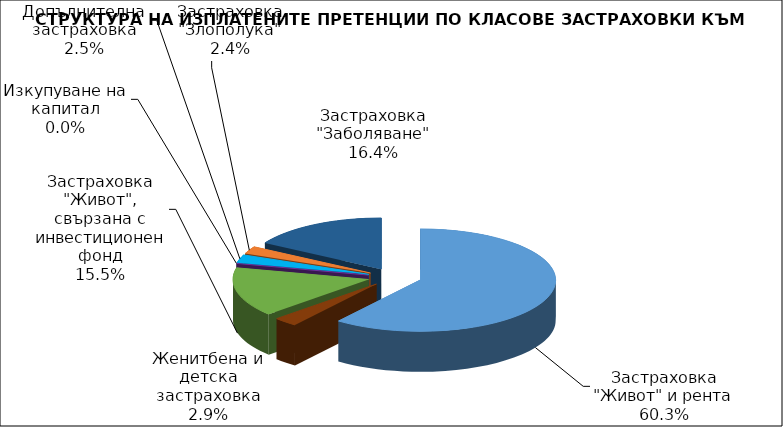
| Category | Застраховка "Живот" и рента |
|---|---|
| Застраховка "Живот" и рента | 66351634.664 |
| Женитбена и детска застраховка | 3188314.668 |
| Застраховка "Живот", свързана с инвестиционен фонд | 17061516.96 |
| Изкупуване на капитал | 0 |
| Допълнителна застраховка | 2792468.276 |
| Застраховка "Злополука" | 2599785.728 |
| Застраховка "Заболяване" | 18090497.766 |